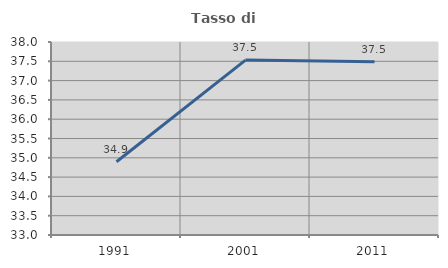
| Category | Tasso di occupazione   |
|---|---|
| 1991.0 | 34.897 |
| 2001.0 | 37.53 |
| 2011.0 | 37.49 |